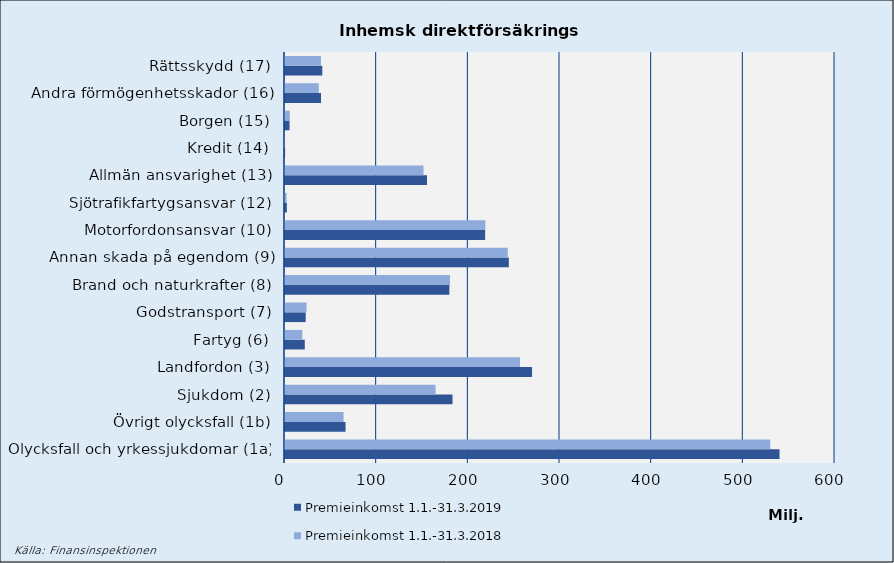
| Category | Premieinkomst |
|---|---|
| Olycksfall och yrkessjukdomar (1a) | 529351.97 |
| Övrigt olycksfall (1b) | 63873.597 |
| Sjukdom (2) | 164281.486 |
| Landfordon (3) | 256416.491 |
| Fartyg (6) | 18856.443 |
| Godstransport (7) | 23513.692 |
| Brand och naturkrafter (8) | 179946.903 |
| Annan skada på egendom (9) | 243022.5 |
| Motorfordonsansvar (10) | 218547.141 |
| Sjötrafikfartygsansvar (12) | 1778.564 |
| Allmän ansvarighet (13) | 151094.226 |
| Kredit (14) | 67.372 |
| Borgen (15) | 5215.313 |
| Andra förmögenhetsskador (16) | 36846.547 |
| Rättsskydd (17) | 39228.599 |